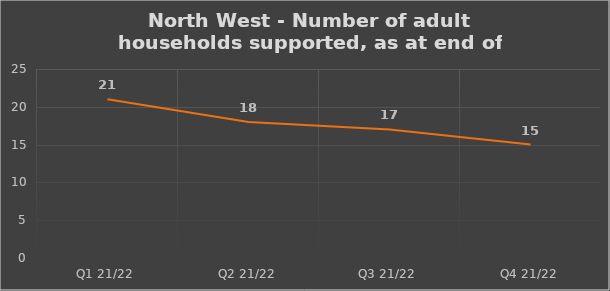
| Category | Number of financially supported households at end of quarter |
|---|---|
| Q1 21/22 | 21 |
| Q2 21/22 | 18 |
| Q3 21/22 | 17 |
| Q4 21/22 | 15 |